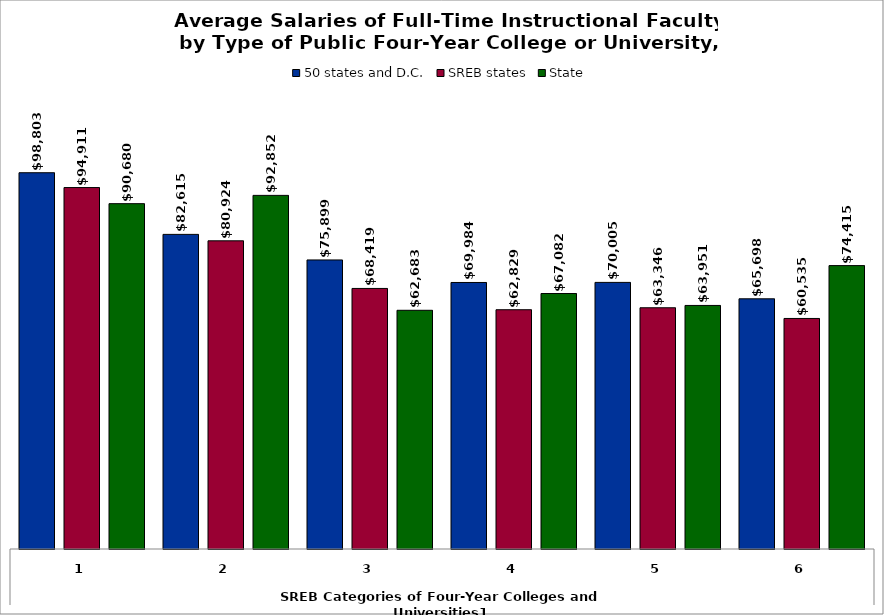
| Category | 50 states and D.C. | SREB states | State |
|---|---|---|---|
| 0 | 98803.203 | 94910.744 | 90679.997 |
| 1 | 82614.781 | 80923.809 | 92852.282 |
| 2 | 75899.134 | 68418.865 | 62683.044 |
| 3 | 69984.23 | 62828.858 | 67081.645 |
| 4 | 70004.823 | 63346.35 | 63951.314 |
| 5 | 65698.48 | 60535.286 | 74415.189 |